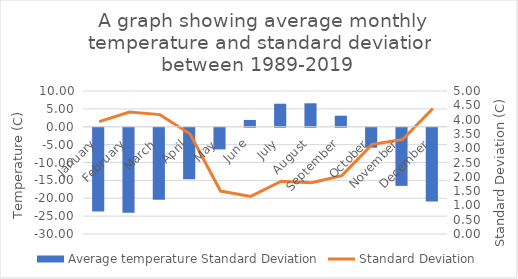
| Category | Average temperature Standard Deviation |
|---|---|
| January | -23.393 |
| February | -23.77 |
| March | -20.17 |
| April | -14.39 |
| May | -6.066 |
| June | 1.906 |
| July | 6.443 |
| August | 6.563 |
| September | 3.09 |
| October | -5.57 |
| November | -16.253 |
| December | -20.65 |